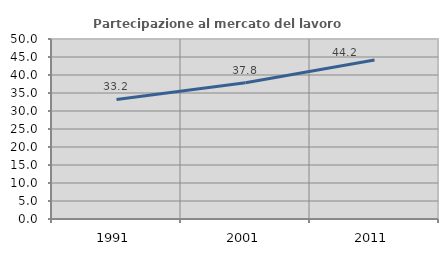
| Category | Partecipazione al mercato del lavoro  femminile |
|---|---|
| 1991.0 | 33.225 |
| 2001.0 | 37.833 |
| 2011.0 | 44.179 |